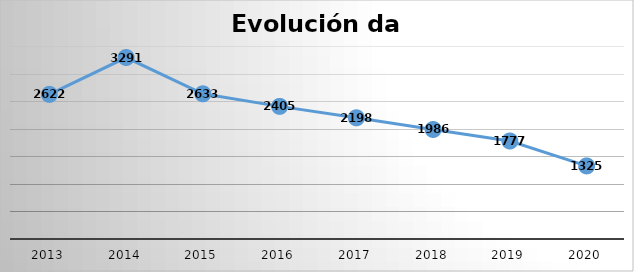
| Category | Series 0 |
|---|---|
| 2013.0 | 2622 |
| 2014.0 | 3291 |
| 2015.0 | 2633 |
| 2016.0 | 2405 |
| 2017.0 | 2198 |
| 2018.0 | 1986 |
| 2019.0 | 1777 |
| 2020.0 | 1325 |